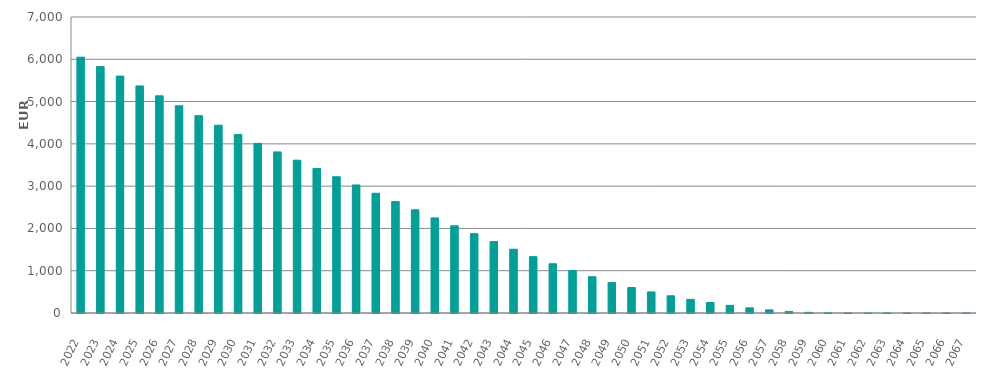
| Category | EUR Millions |
|---|---|
| 2022.0 | 6050000000.05 |
| 2023.0 | 5828097804.673 |
| 2024.0 | 5602513456.3 |
| 2025.0 | 5370258122.796 |
| 2026.0 | 5135877778.785 |
| 2027.0 | 4900486084.364 |
| 2028.0 | 4666829430.618 |
| 2029.0 | 4440534858.531 |
| 2030.0 | 4222330453.826 |
| 2031.0 | 4011961856.02 |
| 2032.0 | 3809534826.581 |
| 2033.0 | 3613174620.522 |
| 2034.0 | 3418642206.18 |
| 2035.0 | 3222748091.722 |
| 2036.0 | 3028096076.452 |
| 2037.0 | 2831800460.303 |
| 2038.0 | 2634464209.78 |
| 2039.0 | 2439870154.246 |
| 2040.0 | 2248894517.704 |
| 2041.0 | 2061226708.192 |
| 2042.0 | 1874645900.047 |
| 2043.0 | 1688565405.362 |
| 2044.0 | 1507764029.423 |
| 2045.0 | 1332535539.266 |
| 2046.0 | 1164960514.595 |
| 2047.0 | 1006468367.972 |
| 2048.0 | 858788986.686 |
| 2049.0 | 723334352.371 |
| 2050.0 | 602899697.896 |
| 2051.0 | 498847456.46 |
| 2052.0 | 406944525.379 |
| 2053.0 | 323553951.595 |
| 2054.0 | 248170243.626 |
| 2055.0 | 180832611.453 |
| 2056.0 | 122165025.891 |
| 2057.0 | 73632025.775 |
| 2058.0 | 37622120.786 |
| 2059.0 | 14474662.94 |
| 2060.0 | 3337888.083 |
| 2061.0 | 221285.427 |
| 2062.0 | 41716.292 |
| 2063.0 | 17972.431 |
| 2064.0 | 6048.252 |
| 2065.0 | 2526.642 |
| 2066.0 | 0 |
| 2067.0 | 0 |